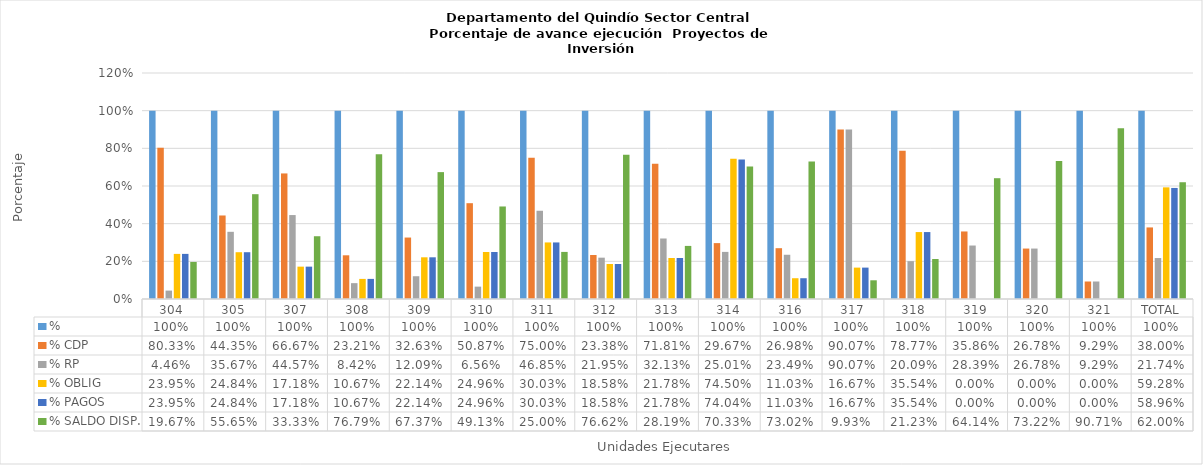
| Category | % | % CDP | % RP | % OBLIG | % PAGOS | % SALDO DISP. |
|---|---|---|---|---|---|---|
| 304 | 1 | 0.803 | 0.045 | 0.24 | 0.24 | 0.197 |
| 305 | 1 | 0.443 | 0.357 | 0.248 | 0.248 | 0.557 |
| 307 | 1 | 0.667 | 0.446 | 0.172 | 0.172 | 0.333 |
| 308 | 1 | 0.232 | 0.084 | 0.107 | 0.107 | 0.768 |
| 309 | 1 | 0.326 | 0.121 | 0.221 | 0.221 | 0.674 |
| 310 | 1 | 0.509 | 0.066 | 0.25 | 0.25 | 0.491 |
| 311 | 1 | 0.75 | 0.469 | 0.3 | 0.3 | 0.25 |
| 312 | 1 | 0.234 | 0.219 | 0.186 | 0.186 | 0.766 |
| 313 | 1 | 0.718 | 0.321 | 0.218 | 0.218 | 0.282 |
| 314 | 1 | 0.297 | 0.25 | 0.745 | 0.74 | 0.703 |
| 316 | 1 | 0.27 | 0.235 | 0.11 | 0.11 | 0.73 |
| 317 | 1 | 0.901 | 0.901 | 0.167 | 0.167 | 0.099 |
| 318 | 1 | 0.788 | 0.201 | 0.355 | 0.355 | 0.212 |
| 319 | 1 | 0.359 | 0.284 | 0 | 0 | 0.641 |
| 320 | 1 | 0.268 | 0.268 | 0 | 0 | 0.732 |
| 321 | 1 | 0.093 | 0.093 | 0 | 0 | 0.907 |
| TOTAL | 1 | 0.38 | 0.217 | 0.593 | 0.59 | 0.62 |